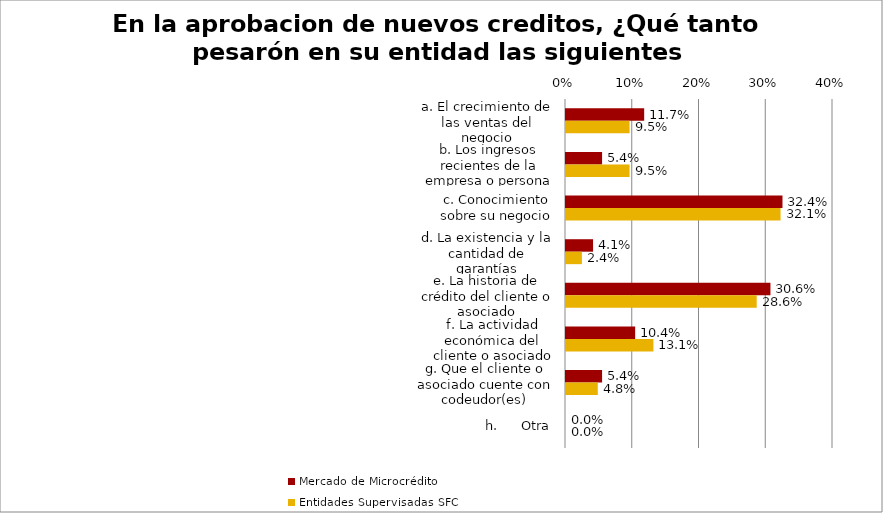
| Category | Mercado de Microcrédito | Entidades Supervisadas SFC |
|---|---|---|
| a. El crecimiento de las ventas del negocio | 0.117 | 0.095 |
| b. Los ingresos recientes de la empresa o persona natural | 0.054 | 0.095 |
| c. Conocimiento sobre su negocio | 0.324 | 0.321 |
| d. La existencia y la cantidad de garantías | 0.041 | 0.024 |
| e. La historia de crédito del cliente o asociado | 0.306 | 0.286 |
| f. La actividad económica del cliente o asociado | 0.104 | 0.131 |
| g. Que el cliente o asociado cuente con codeudor(es) | 0.054 | 0.048 |
| h.      Otra | 0 | 0 |